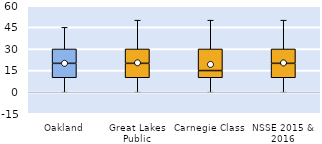
| Category | 25th | 50th | 75th |
|---|---|---|---|
| Oakland | 10 | 10 | 10 |
| Great Lakes Public | 10 | 10 | 10 |
| Carnegie Class | 10 | 5 | 15 |
| NSSE 2015 & 2016 | 10 | 10 | 10 |